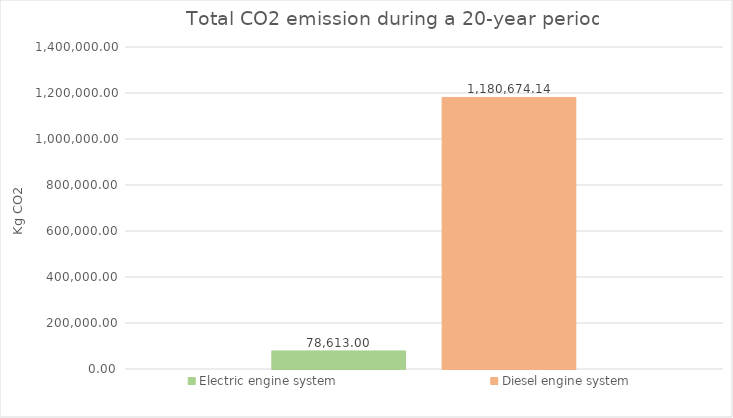
| Category | Electric engine system | Diesel engine system |
|---|---|---|
| 0 | 78612.998 | 1180674.143 |